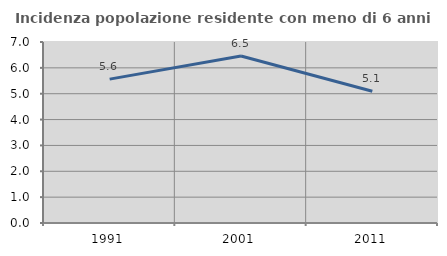
| Category | Incidenza popolazione residente con meno di 6 anni |
|---|---|
| 1991.0 | 5.564 |
| 2001.0 | 6.457 |
| 2011.0 | 5.097 |